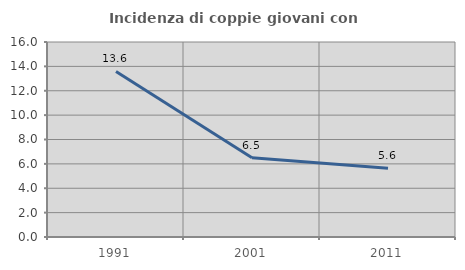
| Category | Incidenza di coppie giovani con figli |
|---|---|
| 1991.0 | 13.586 |
| 2001.0 | 6.508 |
| 2011.0 | 5.64 |